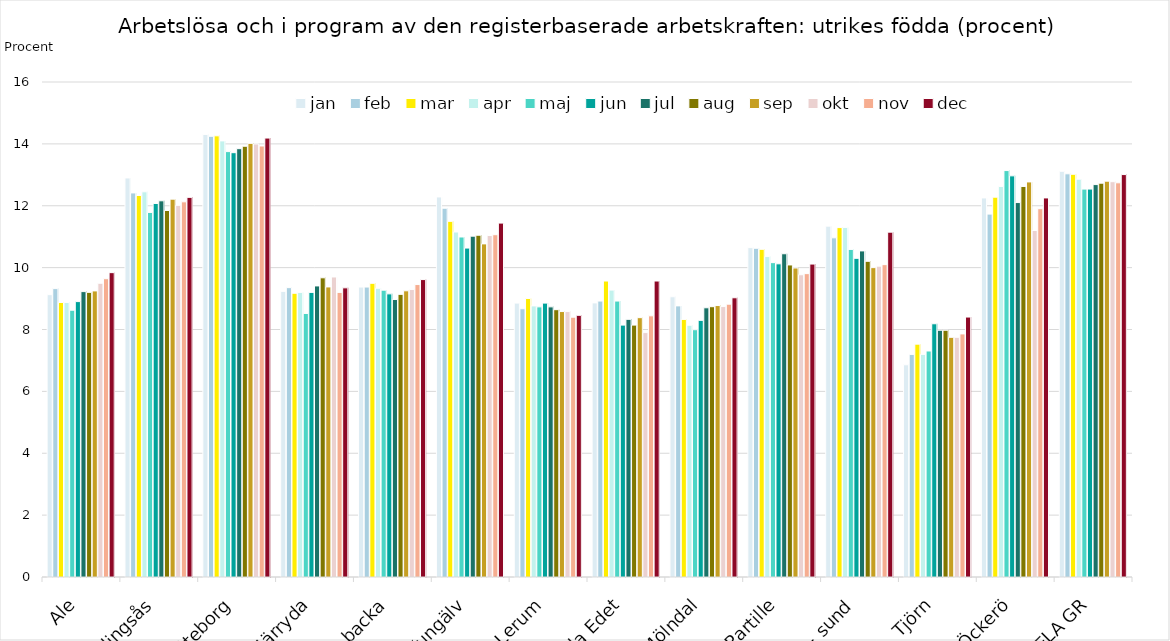
| Category | jan | feb | mar | apr | maj | jun | jul | aug | sep | okt | nov | dec |
|---|---|---|---|---|---|---|---|---|---|---|---|---|
| Ale | 9.126 | 9.321 | 8.874 | 8.874 | 8.624 | 8.902 | 9.225 | 9.2 | 9.247 | 9.494 | 9.641 | 9.837 |
| Alingsås | 12.898 | 12.414 | 12.332 | 12.451 | 11.784 | 12.073 | 12.16 | 11.846 | 12.213 | 12.012 | 12.127 | 12.271 |
| Göteborg | 14.305 | 14.245 | 14.26 | 14.096 | 13.75 | 13.715 | 13.845 | 13.924 | 14.017 | 13.998 | 13.932 | 14.188 |
| Härryda | 9.232 | 9.353 | 9.17 | 9.2 | 8.518 | 9.2 | 9.408 | 9.671 | 9.376 | 9.697 | 9.2 | 9.347 |
| Kungs- backa | 9.372 | 9.372 | 9.493 | 9.332 | 9.271 | 9.152 | 8.969 | 9.136 | 9.251 | 9.291 | 9.453 | 9.614 |
| Kungälv | 12.284 | 11.92 | 11.496 | 11.151 | 10.99 | 10.632 | 11.017 | 11.047 | 10.767 | 11.037 | 11.064 | 11.439 |
| Lerum | 8.853 | 8.671 | 9.004 | 8.762 | 8.732 | 8.853 | 8.732 | 8.641 | 8.58 | 8.58 | 8.397 | 8.458 |
| Lilla Edet | 8.86 | 8.919 | 9.567 | 9.274 | 8.919 | 8.142 | 8.328 | 8.142 | 8.382 | 7.9 | 8.442 | 9.567 |
| Mölndal | 9.058 | 8.764 | 8.325 | 8.137 | 7.993 | 8.295 | 8.702 | 8.737 | 8.774 | 8.742 | 8.818 | 9.026 |
| Partille | 10.646 | 10.626 | 10.592 | 10.358 | 10.161 | 10.123 | 10.448 | 10.087 | 9.988 | 9.769 | 9.806 | 10.115 |
| Stenung- sund | 11.341 | 10.963 | 11.294 | 11.3 | 10.588 | 10.3 | 10.54 | 10.204 | 10 | 10.048 | 10.097 | 11.146 |
| Tjörn | 6.859 | 7.194 | 7.527 | 7.194 | 7.305 | 8.185 | 7.976 | 7.976 | 7.747 | 7.747 | 7.857 | 8.402 |
| Öckerö | 12.253 | 11.73 | 12.277 | 12.623 | 13.137 | 12.967 | 12.103 | 12.623 | 12.77 | 11.2 | 11.905 | 12.253 |
| HELA GR | 13.114 | 13.033 | 13.017 | 12.859 | 12.538 | 12.539 | 12.684 | 12.729 | 12.795 | 12.778 | 12.742 | 13.008 |